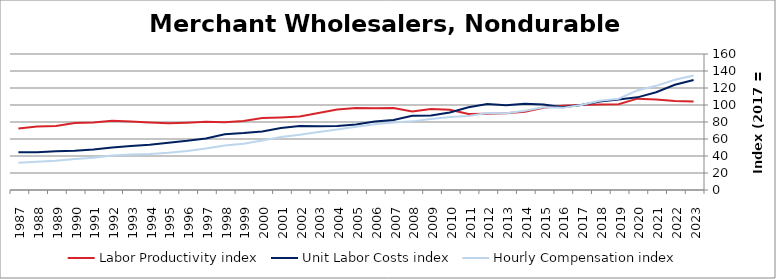
| Category | Labor Productivity index | Unit Labor Costs index | Hourly Compensation index |
|---|---|---|---|
| 2023.0 | 104.084 | 129.422 | 134.707 |
| 2022.0 | 104.663 | 123.854 | 129.629 |
| 2021.0 | 106.529 | 115.037 | 122.547 |
| 2020.0 | 107.481 | 109 | 117.155 |
| 2019.0 | 100.927 | 106.462 | 107.449 |
| 2018.0 | 100.723 | 104.123 | 104.875 |
| 2017.0 | 100 | 100 | 100 |
| 2016.0 | 99.168 | 97.431 | 96.621 |
| 2015.0 | 96.755 | 100.664 | 97.397 |
| 2014.0 | 92.087 | 101.329 | 93.311 |
| 2013.0 | 90.371 | 99.802 | 90.192 |
| 2012.0 | 89.704 | 101.097 | 90.688 |
| 2011.0 | 89.433 | 97.446 | 87.149 |
| 2010.0 | 94.364 | 91.149 | 86.012 |
| 2009.0 | 95.34 | 87.746 | 83.657 |
| 2008.0 | 92.344 | 87.433 | 80.739 |
| 2007.0 | 96.529 | 82.383 | 79.524 |
| 2006.0 | 96.088 | 80.449 | 77.302 |
| 2005.0 | 96.459 | 77.123 | 74.393 |
| 2004.0 | 94.647 | 75.238 | 71.211 |
| 2003.0 | 90.683 | 75.138 | 68.137 |
| 2002.0 | 86.38 | 75.175 | 64.936 |
| 2001.0 | 85.388 | 72.978 | 62.314 |
| 2000.0 | 84.685 | 68.868 | 58.321 |
| 1999.0 | 81.239 | 67.033 | 54.457 |
| 1998.0 | 79.609 | 65.693 | 52.298 |
| 1997.0 | 80.349 | 60.69 | 48.763 |
| 1996.0 | 79.258 | 57.898 | 45.889 |
| 1995.0 | 78.591 | 55.603 | 43.699 |
| 1994.0 | 79.444 | 53.337 | 42.373 |
| 1993.0 | 80.549 | 51.78 | 41.708 |
| 1992.0 | 81.541 | 49.943 | 40.724 |
| 1991.0 | 79.379 | 47.731 | 37.888 |
| 1990.0 | 78.852 | 46.3 | 36.508 |
| 1989.0 | 75.267 | 45.717 | 34.41 |
| 1988.0 | 74.778 | 44.397 | 33.2 |
| 1987.0 | 72.35 | 44.368 | 32.1 |